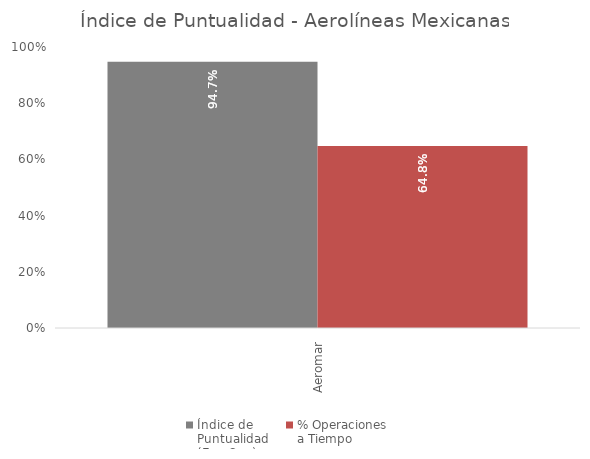
| Category | Índice de 
Puntualidad
(Ene-Sep) | % Operaciones 
a Tiempo |
|---|---|---|
| Aeromar | 0.947 | 0.648 |